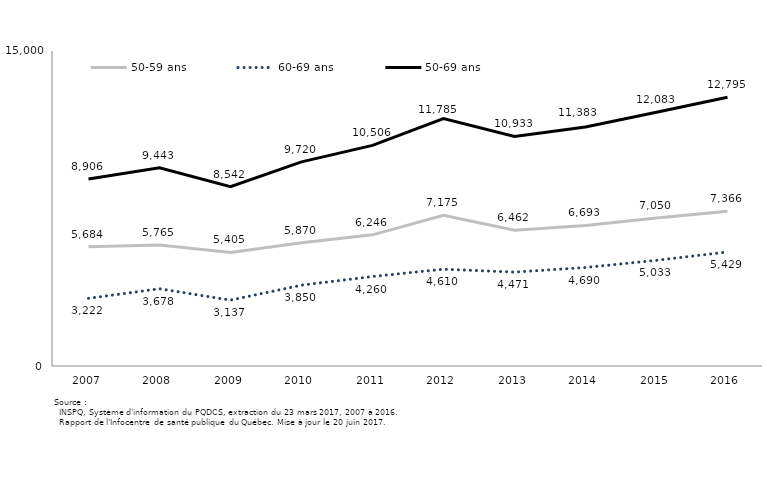
| Category | 50-59 ans | 60-69 ans | 50-69 ans |
|---|---|---|---|
| 2007.0 | 5684 | 3222 | 8906 |
| 2008.0 | 5765 | 3678 | 9443 |
| 2009.0 | 5405 | 3137 | 8542 |
| 2010.0 | 5870 | 3850 | 9720 |
| 2011.0 | 6246 | 4260 | 10506 |
| 2012.0 | 7175 | 4610 | 11785 |
| 2013.0 | 6462 | 4471 | 10933 |
| 2014.0 | 6693 | 4690 | 11383 |
| 2015.0 | 7050 | 5033 | 12083 |
| 2016.0 | 7366 | 5429 | 12795 |